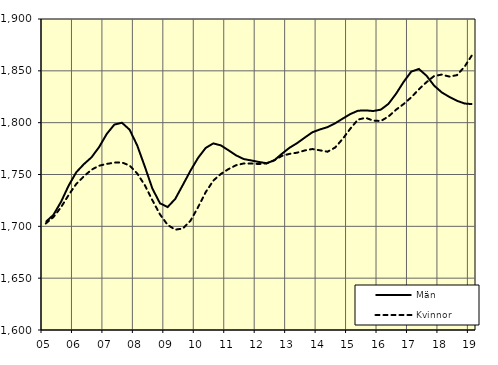
| Category | Män | Kvinnor |
|---|---|---|
| 5.0 | 1704.27 | 1702.77 |
| nan | 1711.04 | 1708.91 |
| 6.0 | 1723.6 | 1718.42 |
| 6.0 | 1739.29 | 1730.22 |
| 6.0 | 1752.15 | 1740.9 |
| nan | 1759.97 | 1748.27 |
| 7.0 | 1766.55 | 1754.59 |
| 7.0 | 1776.45 | 1758.46 |
| 7.0 | 1789.08 | 1760.19 |
| nan | 1798.14 | 1761.45 |
| 8.0 | 1799.91 | 1761.59 |
| 8.0 | 1793.29 | 1758.7 |
| 8.0 | 1778.13 | 1751.03 |
| nan | 1757.73 | 1739.74 |
| 9.0 | 1736.38 | 1725.18 |
| 9.0 | 1722.18 | 1711.46 |
| 9.0 | 1718.61 | 1701.38 |
| nan | 1726.45 | 1696.79 |
| 10.0 | 1739.93 | 1697.9 |
| 10.0 | 1753.68 | 1705.35 |
| 10.0 | 1766.05 | 1718.48 |
| nan | 1775.65 | 1732.93 |
| 11.0 | 1780 | 1744.1 |
| 11.0 | 1778.05 | 1750.58 |
| 11.0 | 1773.32 | 1755.25 |
| nan | 1768.41 | 1758.96 |
| 12.0 | 1764.9 | 1760.66 |
| 12.0 | 1763.53 | 1760.56 |
| 12.0 | 1762.06 | 1760.11 |
| nan | 1760.87 | 1760.7 |
| 13.0 | 1763.67 | 1763.69 |
| 13.0 | 1769.96 | 1767.92 |
| 13.0 | 1775.75 | 1769.89 |
| nan | 1780.23 | 1771.04 |
| 14.0 | 1785.53 | 1773.16 |
| 14.0 | 1790.69 | 1774.58 |
| 14.0 | 1793.45 | 1773.32 |
| nan | 1795.69 | 1771.99 |
| 15.0 | 1799.39 | 1776.02 |
| 15.0 | 1803.92 | 1784.42 |
| 15.0 | 1808.33 | 1794.3 |
| nan | 1811.52 | 1802.98 |
| 16.0 | 1811.85 | 1804.68 |
| 16.0 | 1811.23 | 1802.04 |
| 16.0 | 1812.55 | 1801.57 |
| nan | 1818.13 | 1805.91 |
| 17.0 | 1827.84 | 1812.47 |
| 17.0 | 1839.39 | 1818.01 |
| 17.0 | 1849.28 | 1824.46 |
| nan | 1851.77 | 1832.2 |
| 18.0 | 1845.29 | 1839.08 |
| 18.0 | 1835.73 | 1844.98 |
| 18.0 | 1829.21 | 1846.38 |
| nan | 1824.84 | 1844.45 |
| 19.0 | 1821.1 | 1845.84 |
| 19.0 | 1818.48 | 1853.98 |
| 19.0 | 1817.89 | 1865.43 |